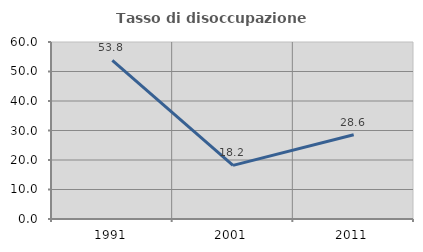
| Category | Tasso di disoccupazione giovanile  |
|---|---|
| 1991.0 | 53.774 |
| 2001.0 | 18.182 |
| 2011.0 | 28.571 |